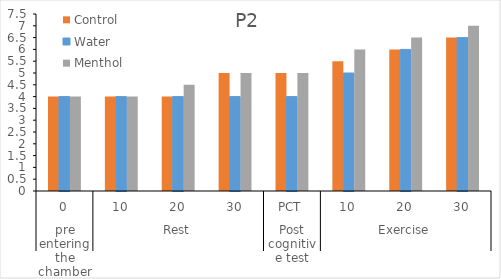
| Category | Control | Water | Menthol  |
|---|---|---|---|
| 0 | 4 | 4 | 4 |
| 1 | 4 | 4 | 4 |
| 2 | 4 | 4 | 4.5 |
| 3 | 5 | 4 | 5 |
| 4 | 5 | 4 | 5 |
| 5 | 5.5 | 5 | 6 |
| 6 | 6 | 6 | 6.5 |
| 7 | 6.5 | 6.5 | 7 |